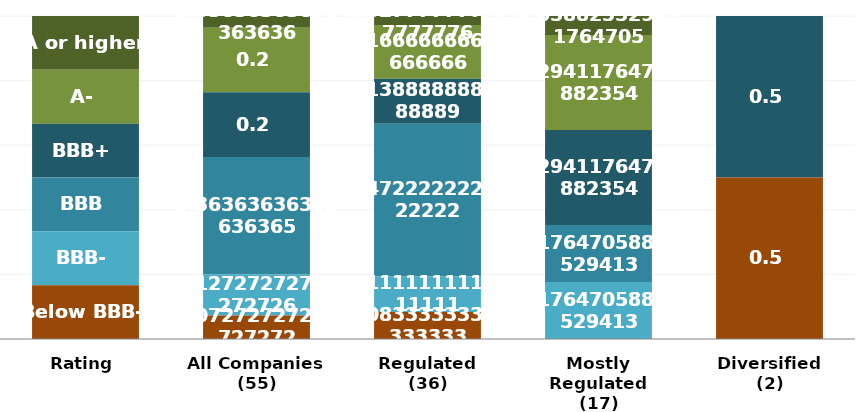
| Category | A or higher | A- | BBB+ | BBB | BBB- | Below BBB- |
|---|---|---|---|---|---|---|
| Rating | 1 | 1 | 1 | 1 | 1 | 1 |
| All Companies
(55) | 2 | 11 | 11 | 20 | 7 | 4 |
| Regulated
(36) | 1 | 6 | 5 | 17 | 4 | 3 |
| Mostly Regulated
(17) | 1 | 5 | 5 | 3 | 3 | 0 |
| Diversified
(2) | 0 | 0 | 1 | 0 | 0 | 1 |